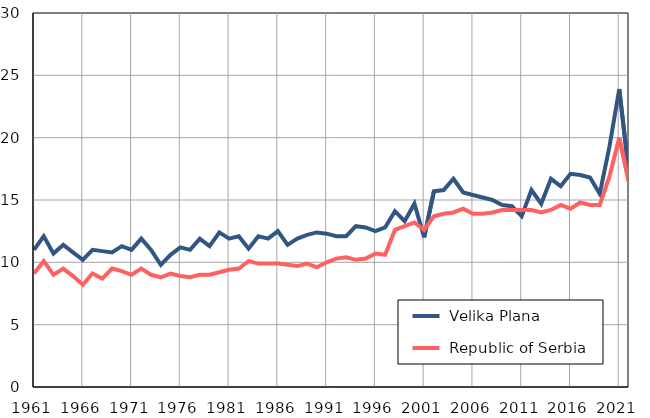
| Category |  Velika Plana |  Republic of Serbia |
|---|---|---|
| 1961.0 | 11 | 9.1 |
| 1962.0 | 12.1 | 10.1 |
| 1963.0 | 10.7 | 9 |
| 1964.0 | 11.4 | 9.5 |
| 1965.0 | 10.8 | 8.9 |
| 1966.0 | 10.2 | 8.2 |
| 1967.0 | 11 | 9.1 |
| 1968.0 | 10.9 | 8.7 |
| 1969.0 | 10.8 | 9.5 |
| 1970.0 | 11.3 | 9.3 |
| 1971.0 | 11 | 9 |
| 1972.0 | 11.9 | 9.5 |
| 1973.0 | 11 | 9 |
| 1974.0 | 9.8 | 8.8 |
| 1975.0 | 10.6 | 9.1 |
| 1976.0 | 11.2 | 8.9 |
| 1977.0 | 11 | 8.8 |
| 1978.0 | 11.9 | 9 |
| 1979.0 | 11.3 | 9 |
| 1980.0 | 12.4 | 9.2 |
| 1981.0 | 11.9 | 9.4 |
| 1982.0 | 12.1 | 9.5 |
| 1983.0 | 11.1 | 10.1 |
| 1984.0 | 12.1 | 9.9 |
| 1985.0 | 11.9 | 9.9 |
| 1986.0 | 12.5 | 9.9 |
| 1987.0 | 11.4 | 9.8 |
| 1988.0 | 11.9 | 9.7 |
| 1989.0 | 12.2 | 9.9 |
| 1990.0 | 12.4 | 9.6 |
| 1991.0 | 12.3 | 10 |
| 1992.0 | 12.1 | 10.3 |
| 1993.0 | 12.1 | 10.4 |
| 1994.0 | 12.9 | 10.2 |
| 1995.0 | 12.8 | 10.3 |
| 1996.0 | 12.5 | 10.7 |
| 1997.0 | 12.8 | 10.6 |
| 1998.0 | 14.1 | 12.6 |
| 1999.0 | 13.3 | 12.9 |
| 2000.0 | 14.7 | 13.2 |
| 2001.0 | 12 | 12.6 |
| 2002.0 | 15.7 | 13.7 |
| 2003.0 | 15.8 | 13.9 |
| 2004.0 | 16.7 | 14 |
| 2005.0 | 15.6 | 14.3 |
| 2006.0 | 15.4 | 13.9 |
| 2007.0 | 15.2 | 13.9 |
| 2008.0 | 15 | 14 |
| 2009.0 | 14.6 | 14.2 |
| 2010.0 | 14.5 | 14.2 |
| 2011.0 | 13.7 | 14.2 |
| 2012.0 | 15.8 | 14.2 |
| 2013.0 | 14.7 | 14 |
| 2014.0 | 16.7 | 14.2 |
| 2015.0 | 16.1 | 14.6 |
| 2016.0 | 17.1 | 14.3 |
| 2017.0 | 17 | 14.8 |
| 2018.0 | 16.8 | 14.6 |
| 2019.0 | 15.5 | 14.6 |
| 2020.0 | 19.3 | 16.9 |
| 2021.0 | 23.9 | 20 |
| 2022.0 | 17.1 | 16.4 |